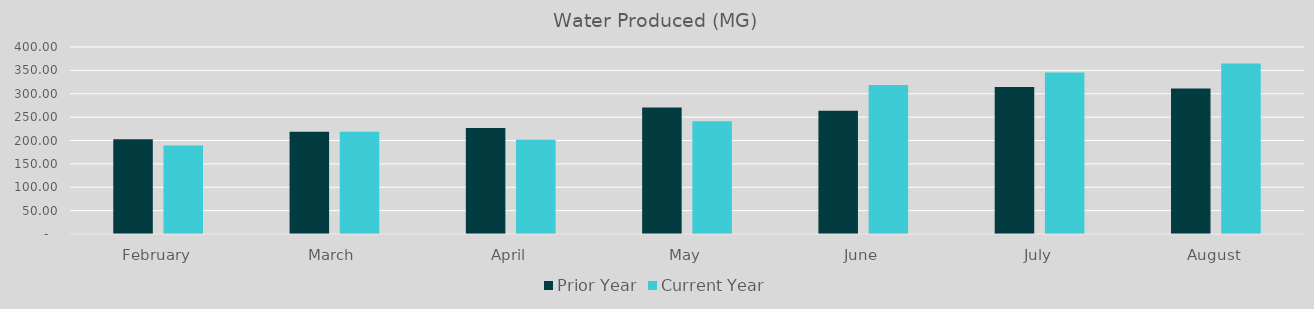
| Category | Prior Year | Current Year |
|---|---|---|
| February | 202.92 | 189.14 |
| March | 218.89 | 218.9 |
| April | 226.62 | 201.4 |
| May | 270.85 | 241.3 |
| June | 263.67 | 318.9 |
| July | 314.55 | 345.4 |
| August | 311.17 | 364.8 |